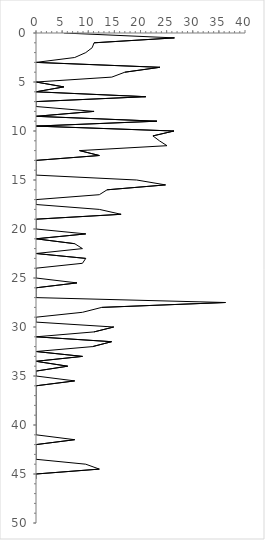
| Category | Series 0 |
|---|---|
| 5.333333333333333 | 0 |
| 26.501035196687372 | 0.5 |
| 11.111111111111112 | 1 |
| 10.75268817204301 | 1.5 |
| 9.523809523809524 | 2 |
| 7.407407407407407 | 2.5 |
| 0.0 | 3 |
| 23.703703703703706 | 3.5 |
| 17.006802721088434 | 4 |
| 14.509803921568627 | 4.5 |
| 0.0 | 5 |
| 5.333333333333333 | 5.5 |
| 0.0 | 6 |
| 21.01010101010101 | 6.5 |
| 0.0 | 7 |
| 0.0 | 7.5 |
| 11.111111111111112 | 8 |
| 0.0 | 8.5 |
| 23.14814814814815 | 9 |
| 0.0 | 9.5 |
| 26.405228758169937 | 10 |
| 22.377622377622377 | 10.5 |
| 23.623853211009173 | 11 |
| 25.071225071225072 | 11.5 |
| 8.333333333333334 | 12 |
| 12.121212121212123 | 12.5 |
| 0.0 | 13 |
| 0.0 | 13.5 |
| 0.0 | 14 |
| 0.0 | 14.5 |
| 19.267822736030826 | 15 |
| 24.78808705612829 | 15.5 |
| 13.605442176870747 | 16 |
| 12.121212121212123 | 16.5 |
| 0.0 | 17 |
| 0.0 | 17.5 |
| 12.121212121212123 | 18 |
| 16.28787878787879 | 18.5 |
| 0.0 | 19 |
| 0.0 | 19.5 |
| 0.0 | 20 |
| 9.523809523809524 | 20.5 |
| 0.0 | 21 |
| 7.407407407407407 | 21.5 |
| 8.88888888888889 | 22 |
| 0.0 | 22.5 |
| 9.523809523809524 | 23 |
| 8.88888888888889 | 23.5 |
| 0.0 | 24 |
| 0.0 | 24.5 |
| 0.0 | 25 |
| 7.843137254901961 | 25.5 |
| 0.0 | 26 |
| 0.0 | 26.5 |
| 0.0 | 27 |
| 36.26490468595731 | 27.5 |
| 12.578616352201257 | 28 |
| 8.88888888888889 | 28.5 |
| 0.0 | 29 |
| 0.0 | 29.5 |
| 14.88095238095238 | 30 |
| 11.111111111111112 | 30.5 |
| 0.0 | 31 |
| 14.462081128747796 | 31.5 |
| 10.822510822510822 | 32 |
| 0.0 | 32.5 |
| 8.88888888888889 | 33 |
| 0.0 | 33.5 |
| 6.060606060606061 | 34 |
| 0.0 | 34.5 |
| 0.0 | 35 |
| 7.407407407407407 | 35.5 |
| 0.0 | 36 |
| 0.0 | 36.5 |
| 0.0 | 37 |
| 0.0 | 37.5 |
| 0.0 | 38 |
| 0.0 | 38.5 |
| 0.0 | 39 |
| 0.0 | 39.5 |
| 0.0 | 40 |
| 0.0 | 40.5 |
| 0.0 | 41 |
| 7.407407407407407 | 41.5 |
| 0.0 | 42 |
| 0.0 | 42.5 |
| 0.0 | 43 |
| 0.0 | 43.5 |
| 9.523809523809524 | 44 |
| 12.121212121212123 | 44.5 |
| 0.0 | 45 |
| 0.0 | 45.5 |